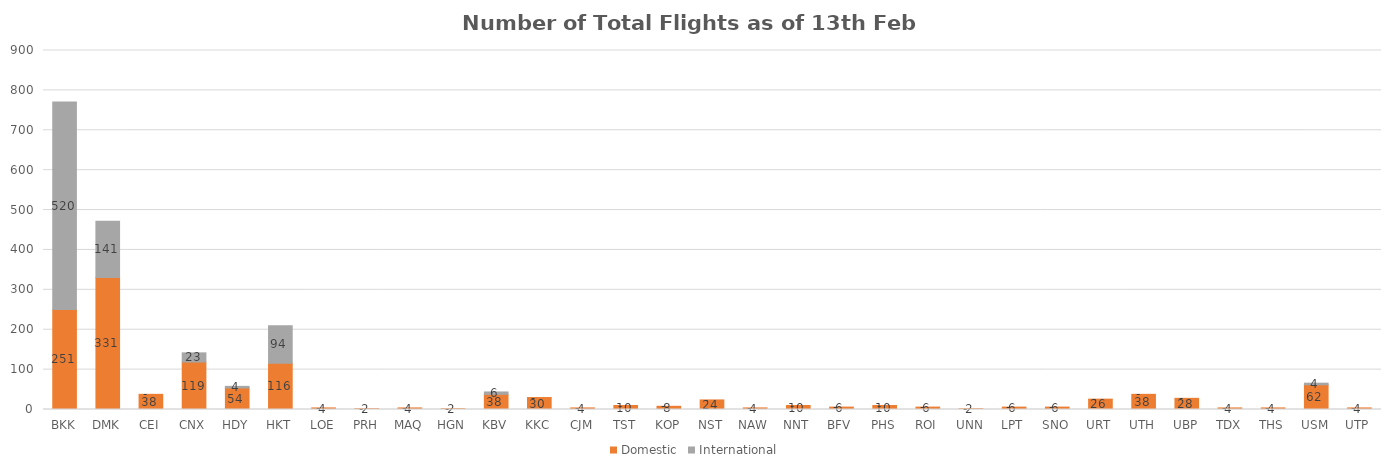
| Category | Domestic | International |
|---|---|---|
| BKK | 251 | 520 |
| DMK | 331 | 141 |
| CEI | 38 | 0 |
| CNX | 119 | 23 |
| HDY | 54 | 4 |
| HKT | 116 | 94 |
| LOE | 4 | 0 |
| PRH | 2 | 0 |
| MAQ | 4 | 0 |
| HGN | 2 | 0 |
| KBV | 38 | 6 |
| KKC | 30 | 0 |
| CJM | 4 | 0 |
| TST | 10 | 0 |
| KOP | 8 | 0 |
| NST | 24 | 0 |
| NAW | 4 | 0 |
| NNT | 10 | 0 |
| BFV | 6 | 0 |
| PHS | 10 | 0 |
| ROI | 6 | 0 |
| UNN | 2 | 0 |
| LPT | 6 | 0 |
| SNO | 6 | 0 |
| URT | 26 | 0 |
| UTH | 38 | 0 |
| UBP | 28 | 0 |
| TDX | 4 | 0 |
| THS | 4 | 0 |
| USM | 62 | 4 |
| UTP | 4 | 0 |